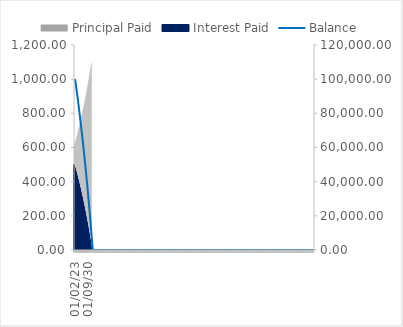
| Category | Principal Paid | Interest Paid |
|---|---|---|
| 01/02/23 | 610.205 | 500 |
| 01/03/23 | 613.256 | 496.949 |
| 01/04/23 | 616.322 | 493.883 |
| 01/05/23 | 619.404 | 490.801 |
| 01/06/23 | 622.501 | 487.704 |
| 01/07/23 | 625.613 | 484.592 |
| 01/08/23 | 628.742 | 481.463 |
| 01/09/23 | 631.885 | 478.32 |
| 01/10/23 | 635.045 | 475.16 |
| 01/11/23 | 638.22 | 471.985 |
| 01/12/23 | 641.411 | 468.794 |
| 01/01/24 | 644.618 | 465.587 |
| 01/02/24 | 647.841 | 462.364 |
| 01/03/24 | 651.08 | 459.125 |
| 01/04/24 | 654.336 | 455.869 |
| 01/05/24 | 657.607 | 452.598 |
| 01/06/24 | 660.895 | 449.31 |
| 01/07/24 | 664.2 | 446.005 |
| 01/08/24 | 667.521 | 442.684 |
| 01/09/24 | 670.859 | 439.346 |
| 01/10/24 | 674.213 | 435.992 |
| 01/11/24 | 677.584 | 432.621 |
| 01/12/24 | 680.972 | 429.233 |
| 01/01/25 | 684.377 | 425.828 |
| 01/02/25 | 687.799 | 422.406 |
| 01/03/25 | 691.238 | 418.967 |
| 01/04/25 | 694.694 | 415.511 |
| 01/05/25 | 698.167 | 412.038 |
| 01/06/25 | 701.658 | 408.547 |
| 01/07/25 | 705.166 | 405.039 |
| 01/08/25 | 708.692 | 401.513 |
| 01/09/25 | 712.236 | 397.969 |
| 01/10/25 | 715.797 | 394.408 |
| 01/11/25 | 719.376 | 390.829 |
| 01/12/25 | 722.973 | 387.232 |
| 01/01/26 | 726.588 | 383.617 |
| 01/02/26 | 730.22 | 379.985 |
| 01/03/26 | 733.872 | 376.333 |
| 01/04/26 | 737.541 | 372.664 |
| 01/05/26 | 741.229 | 368.976 |
| 01/06/26 | 744.935 | 365.27 |
| 01/07/26 | 748.659 | 361.546 |
| 01/08/26 | 752.403 | 357.802 |
| 01/09/26 | 756.165 | 354.04 |
| 01/10/26 | 759.946 | 350.259 |
| 01/11/26 | 763.745 | 346.46 |
| 01/12/26 | 767.564 | 342.641 |
| 01/01/27 | 771.402 | 338.803 |
| 01/02/27 | 775.259 | 334.946 |
| 01/03/27 | 779.135 | 331.07 |
| 01/04/27 | 783.031 | 327.174 |
| 01/05/27 | 786.946 | 323.259 |
| 01/06/27 | 790.881 | 319.324 |
| 01/07/27 | 794.835 | 315.37 |
| 01/08/27 | 798.809 | 311.396 |
| 01/09/27 | 802.803 | 307.402 |
| 01/10/27 | 806.817 | 303.388 |
| 01/11/27 | 810.851 | 299.354 |
| 01/12/27 | 814.906 | 295.299 |
| 01/01/28 | 818.98 | 291.225 |
| 01/02/28 | 823.075 | 287.13 |
| 01/03/28 | 827.191 | 283.015 |
| 01/04/28 | 831.326 | 278.879 |
| 01/05/28 | 835.483 | 274.722 |
| 01/06/28 | 839.661 | 270.545 |
| 01/07/28 | 843.859 | 266.346 |
| 01/08/28 | 848.078 | 262.127 |
| 01/09/28 | 852.318 | 257.887 |
| 01/10/28 | 856.58 | 253.625 |
| 01/11/28 | 860.863 | 249.342 |
| 01/12/28 | 865.167 | 245.038 |
| 01/01/29 | 869.493 | 240.712 |
| 01/02/29 | 873.841 | 236.364 |
| 01/03/29 | 878.21 | 231.995 |
| 01/04/29 | 882.601 | 227.604 |
| 01/05/29 | 887.014 | 223.191 |
| 01/06/29 | 891.449 | 218.756 |
| 01/07/29 | 895.906 | 214.299 |
| 01/08/29 | 900.386 | 209.819 |
| 01/09/29 | 904.888 | 205.317 |
| 01/10/29 | 909.412 | 200.793 |
| 01/11/29 | 913.959 | 196.246 |
| 01/12/29 | 918.529 | 191.676 |
| 01/01/30 | 923.122 | 187.083 |
| 01/02/30 | 927.737 | 182.468 |
| 01/03/30 | 932.376 | 177.829 |
| 01/04/30 | 937.038 | 173.167 |
| 01/05/30 | 941.723 | 168.482 |
| 01/06/30 | 946.432 | 163.773 |
| 01/07/30 | 951.164 | 159.041 |
| 01/08/30 | 955.92 | 154.285 |
| 01/09/30 | 960.699 | 149.506 |
| 01/10/30 | 965.503 | 144.702 |
| 01/11/30 | 970.33 | 139.875 |
| 01/12/30 | 975.182 | 135.023 |
| 01/01/31 | 980.058 | 130.147 |
| 01/02/31 | 984.958 | 125.247 |
| 01/03/31 | 989.883 | 120.322 |
| 01/04/31 | 994.832 | 115.373 |
| 01/05/31 | 999.806 | 110.399 |
| 01/06/31 | 1004.805 | 105.4 |
| 01/07/31 | 1009.829 | 100.376 |
| 01/08/31 | 1014.879 | 95.326 |
| 01/09/31 | 1019.953 | 90.252 |
| 01/10/31 | 1025.053 | 85.152 |
| 01/11/31 | 1030.178 | 80.027 |
| 01/12/31 | 1035.329 | 74.876 |
| 01/01/32 | 1040.506 | 69.7 |
| 01/02/32 | 1045.708 | 64.497 |
| 01/03/32 | 1050.937 | 59.268 |
| 01/04/32 | 1056.191 | 54.014 |
| 01/05/32 | 1061.472 | 48.733 |
| 01/06/32 | 1066.78 | 43.425 |
| 01/07/32 | 1072.113 | 38.092 |
| 01/08/32 | 1077.474 | 32.731 |
| 01/09/32 | 1082.861 | 27.344 |
| 01/10/32 | 1088.276 | 21.929 |
| 01/11/32 | 1093.717 | 16.488 |
| 01/12/32 | 1099.186 | 11.019 |
| 01/01/33 | 1104.682 | 5.523 |